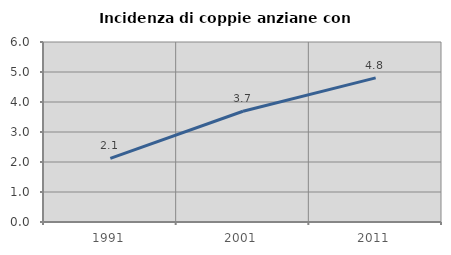
| Category | Incidenza di coppie anziane con figli |
|---|---|
| 1991.0 | 2.123 |
| 2001.0 | 3.693 |
| 2011.0 | 4.804 |